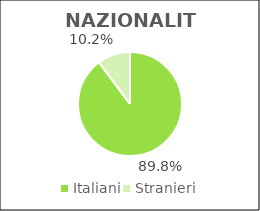
| Category | Series 0 |
|---|---|
| Italiani | 63055 |
| Stranieri | 7160 |